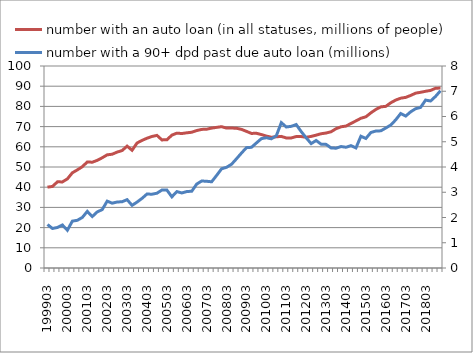
| Category | number with an auto loan (in all statuses, millions of people) |
|---|---|
| 199903.0 | 40.02 |
| 199906.0 | 40.371 |
| 199909.0 | 42.668 |
| 199912.0 | 42.616 |
| 200003.0 | 44.125 |
| 200006.0 | 47.139 |
| 200009.0 | 48.574 |
| 200012.0 | 50.136 |
| 200103.0 | 52.504 |
| 200106.0 | 52.374 |
| 200109.0 | 53.283 |
| 200112.0 | 54.569 |
| 200203.0 | 56.032 |
| 200206.0 | 56.321 |
| 200209.0 | 57.381 |
| 200212.0 | 58.143 |
| 200303.0 | 60.337 |
| 200306.0 | 58.286 |
| 200309.0 | 61.876 |
| 200312.0 | 63.162 |
| 200403.0 | 64.246 |
| 200406.0 | 65.108 |
| 200409.0 | 65.653 |
| 200412.0 | 63.419 |
| 200503.0 | 63.46 |
| 200506.0 | 65.775 |
| 200509.0 | 66.752 |
| 200512.0 | 66.575 |
| 200603.0 | 66.93 |
| 200606.0 | 67.203 |
| 200609.0 | 68.048 |
| 200612.0 | 68.612 |
| 200703.0 | 68.708 |
| 200706.0 | 69.263 |
| 200709.0 | 69.625 |
| 200712.0 | 69.957 |
| 200803.0 | 69.248 |
| 200806.0 | 69.29 |
| 200809.0 | 69.171 |
| 200812.0 | 68.618 |
| 200903.0 | 67.632 |
| 200906.0 | 66.627 |
| 200909.0 | 66.687 |
| 200912.0 | 66.058 |
| 201003.0 | 65.302 |
| 201006.0 | 64.744 |
| 201009.0 | 64.937 |
| 201012.0 | 65.16 |
| 201103.0 | 64.363 |
| 201106.0 | 64.383 |
| 201109.0 | 65.077 |
| 201112.0 | 65.072 |
| 201203.0 | 64.702 |
| 201206.0 | 65.145 |
| 201209.0 | 65.769 |
| 201212.0 | 66.472 |
| 201303.0 | 66.815 |
| 201306.0 | 67.449 |
| 201309.0 | 68.959 |
| 201312.0 | 69.897 |
| 201403.0 | 70.266 |
| 201406.0 | 71.557 |
| 201409.0 | 72.827 |
| 201412.0 | 74.125 |
| 201503.0 | 74.852 |
| 201506.0 | 76.806 |
| 201509.0 | 78.487 |
| 201512.0 | 79.769 |
| 201603.0 | 80.018 |
| 201606.0 | 81.79 |
| 201609.0 | 83.136 |
| 201612.0 | 84.073 |
| 201703.0 | 84.456 |
| 201706.0 | 85.427 |
| 201709.0 | 86.56 |
| 201712.0 | 86.979 |
| 201803.0 | 87.491 |
| 201806.0 | 87.906 |
| 201809.0 | 88.982 |
| 201812.0 | 89.09 |